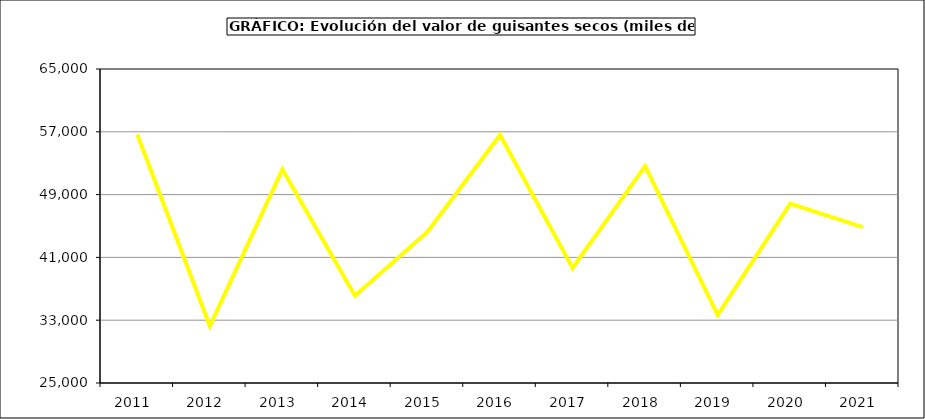
| Category | Valor |
|---|---|
| 2011.0 | 56666.277 |
| 2012.0 | 32251.03 |
| 2013.0 | 52203.832 |
| 2014.0 | 36116.283 |
| 2015.0 | 44267 |
| 2016.0 | 56599 |
| 2017.0 | 39648.556 |
| 2018.0 | 52618.427 |
| 2019.0 | 33672.184 |
| 2020.0 | 47860.594 |
| 2021.0 | 44845.133 |